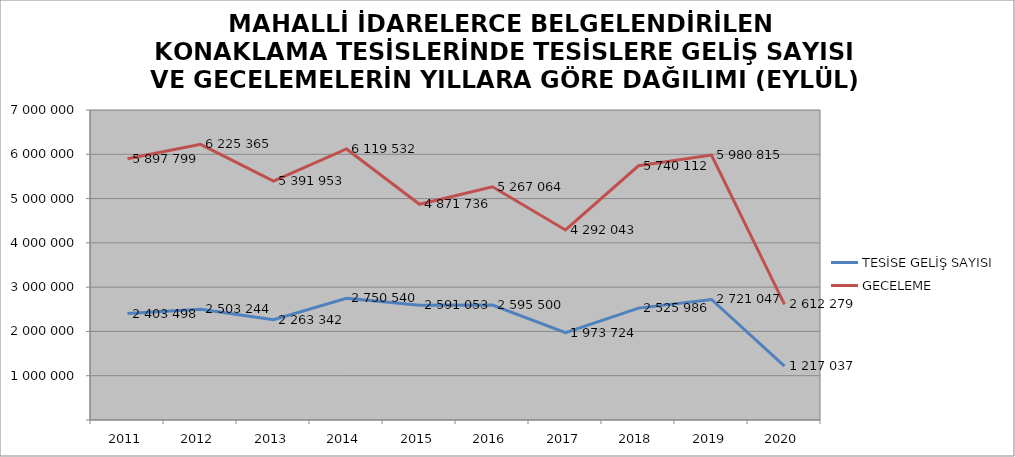
| Category | TESİSE GELİŞ SAYISI | GECELEME |
|---|---|---|
| 2011 | 2403498 | 5897799 |
| 2012 | 2503244 | 6225365 |
| 2013 | 2263342 | 5391953 |
| 2014 | 2750540 | 6119532 |
| 2015 | 2591053 | 4871736 |
| 2016 | 2595500 | 5267064 |
| 2017 | 1973724 | 4292043 |
| 2018 | 2525986 | 5740112 |
| 2019 | 2721047 | 5980815 |
| 2020 | 1217037 | 2612279 |